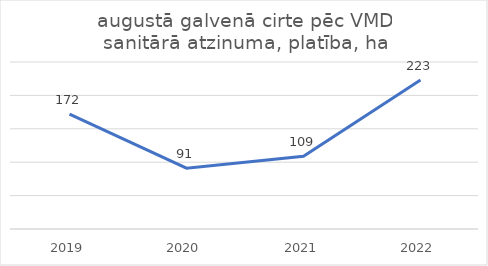
| Category | augustā galvenā cirte pēc VMD sanitārā atzinuma, platība, ha |
|---|---|
| 2019.0 | 172 |
| 2020.0 | 91 |
| 2021.0 | 109 |
| 2022.0 | 223 |